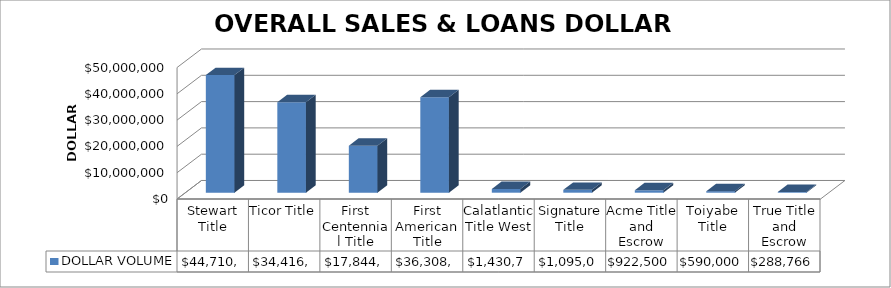
| Category | DOLLAR VOLUME |
|---|---|
| Stewart Title | 44710666.53 |
| Ticor Title | 34416946.8 |
| First Centennial Title | 17844544.8 |
| First American Title | 36308946 |
| Calatlantic Title West | 1430765 |
| Signature Title | 1095000 |
| Acme Title and Escrow | 922500 |
| Toiyabe Title | 590000 |
| True Title and Escrow | 288766 |